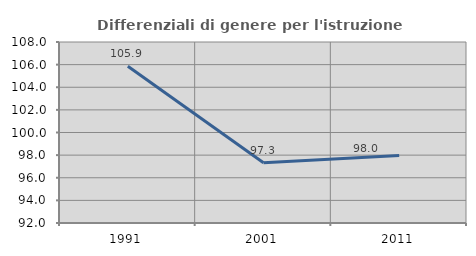
| Category | Differenziali di genere per l'istruzione superiore |
|---|---|
| 1991.0 | 105.854 |
| 2001.0 | 97.326 |
| 2011.0 | 97.958 |